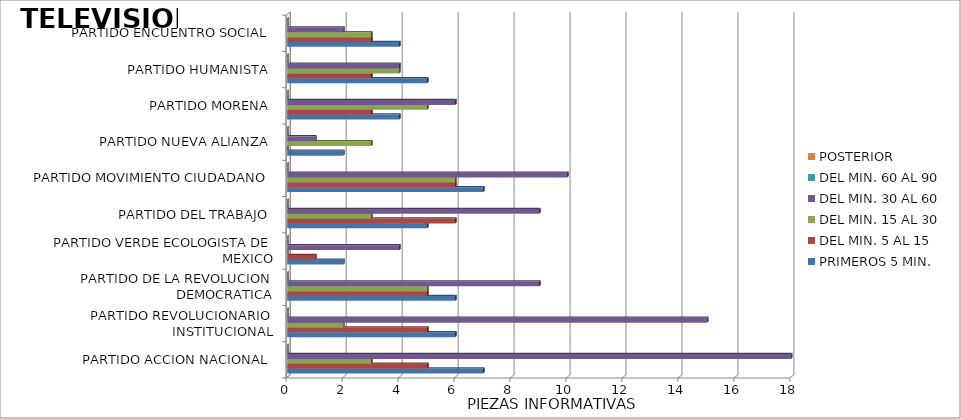
| Category | PRIMEROS 5 MIN. | DEL MIN. 5 AL 15 | DEL MIN. 15 AL 30 | DEL MIN. 30 AL 60 | DEL MIN. 60 AL 90 | POSTERIOR |
|---|---|---|---|---|---|---|
| PARTIDO ACCION NACIONAL | 7 | 5 | 3 | 18 | 0 | 0 |
| PARTIDO REVOLUCIONARIO INSTITUCIONAL | 6 | 5 | 2 | 15 | 0 | 0 |
| PARTIDO DE LA REVOLUCION DEMOCRATICA | 6 | 5 | 5 | 9 | 0 | 0 |
| PARTIDO VERDE ECOLOGISTA DE MEXICO | 2 | 1 | 0 | 4 | 0 | 0 |
| PARTIDO DEL TRABAJO | 5 | 6 | 3 | 9 | 0 | 0 |
| PARTIDO MOVIMIENTO CIUDADANO | 7 | 6 | 6 | 10 | 0 | 0 |
| PARTIDO NUEVA ALIANZA | 2 | 0 | 3 | 1 | 0 | 0 |
| PARTIDO MORENA | 4 | 3 | 5 | 6 | 0 | 0 |
| PARTIDO HUMANISTA | 5 | 3 | 4 | 4 | 0 | 0 |
| PARTIDO ENCUENTRO SOCIAL | 4 | 3 | 3 | 2 | 0 | 0 |